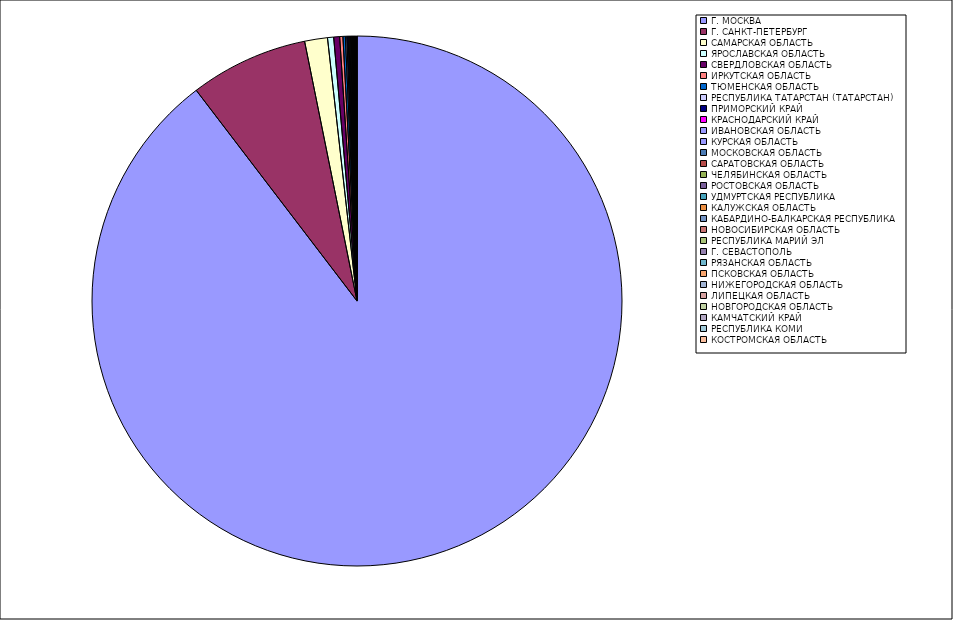
| Category | Оборот |
|---|---|
| Г. МОСКВА | 89.575 |
| Г. САНКТ-ПЕТЕРБУРГ | 7.2 |
| САМАРСКАЯ ОБЛАСТЬ | 1.39 |
| ЯРОСЛАВСКАЯ ОБЛАСТЬ | 0.373 |
| СВЕРДЛОВСКАЯ ОБЛАСТЬ | 0.361 |
| ИРКУТСКАЯ ОБЛАСТЬ | 0.197 |
| ТЮМЕНСКАЯ ОБЛАСТЬ | 0.145 |
| РЕСПУБЛИКА ТАТАРСТАН (ТАТАРСТАН) | 0.084 |
| ПРИМОРСКИЙ КРАЙ | 0.078 |
| КРАСНОДАРСКИЙ КРАЙ | 0.052 |
| ИВАНОВСКАЯ ОБЛАСТЬ | 0.05 |
| КУРСКАЯ ОБЛАСТЬ | 0.048 |
| МОСКОВСКАЯ ОБЛАСТЬ | 0.046 |
| САРАТОВСКАЯ ОБЛАСТЬ | 0.043 |
| ЧЕЛЯБИНСКАЯ ОБЛАСТЬ | 0.032 |
| РОСТОВСКАЯ ОБЛАСТЬ | 0.03 |
| УДМУРТСКАЯ РЕСПУБЛИКА | 0.029 |
| КАЛУЖСКАЯ ОБЛАСТЬ | 0.027 |
| КАБАРДИНО-БАЛКАРСКАЯ РЕСПУБЛИКА | 0.022 |
| НОВОСИБИРСКАЯ ОБЛАСТЬ | 0.022 |
| РЕСПУБЛИКА МАРИЙ ЭЛ | 0.019 |
| Г. СЕВАСТОПОЛЬ | 0.018 |
| РЯЗАНСКАЯ ОБЛАСТЬ | 0.016 |
| ПСКОВСКАЯ ОБЛАСТЬ | 0.016 |
| НИЖЕГОРОДСКАЯ ОБЛАСТЬ | 0.015 |
| ЛИПЕЦКАЯ ОБЛАСТЬ | 0.015 |
| НОВГОРОДСКАЯ ОБЛАСТЬ | 0.012 |
| КАМЧАТСКИЙ КРАЙ | 0.009 |
| РЕСПУБЛИКА КОМИ | 0.009 |
| КОСТРОМСКАЯ ОБЛАСТЬ | 0.008 |